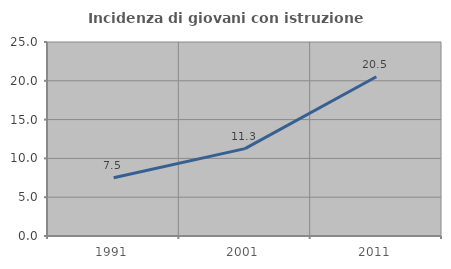
| Category | Incidenza di giovani con istruzione universitaria |
|---|---|
| 1991.0 | 7.504 |
| 2001.0 | 11.262 |
| 2011.0 | 20.522 |